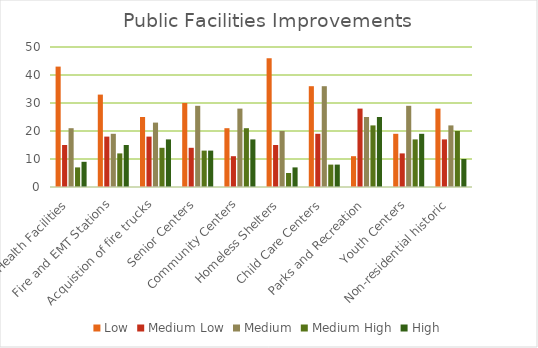
| Category | Low | Medium Low | Medium | Medium High | High |
|---|---|---|---|---|---|
| Health Facilities | 43 | 15 | 21 | 7 | 9 |
| Fire and EMT Stations | 33 | 18 | 19 | 12 | 15 |
| Acquistion of fire trucks | 25 | 18 | 23 | 14 | 17 |
| Senior Centers | 30 | 14 | 29 | 13 | 13 |
| Community Centers | 21 | 11 | 28 | 21 | 17 |
| Homeless Shelters | 46 | 15 | 20 | 5 | 7 |
| Child Care Centers | 36 | 19 | 36 | 8 | 8 |
| Parks and Recreation | 11 | 28 | 25 | 22 | 25 |
| Youth Centers | 19 | 12 | 29 | 17 | 19 |
| Non-residential historic | 28 | 17 | 22 | 20 | 10 |